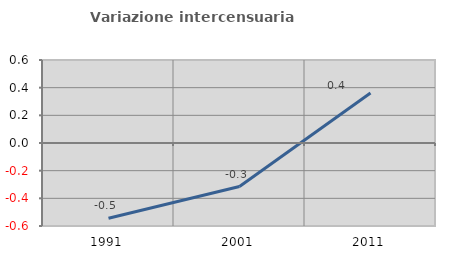
| Category | Variazione intercensuaria annua |
|---|---|
| 1991.0 | -0.544 |
| 2001.0 | -0.315 |
| 2011.0 | 0.362 |